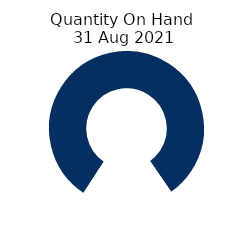
| Category | Quantity On Hand 
31 Aug 2021 |
|---|---|
| 0 | 130 |
| 1 | 0 |
| 2 | 30 |